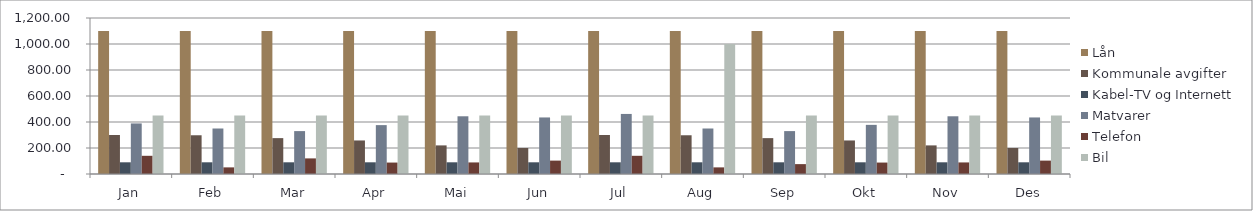
| Category | Lån | Kommunale avgifter | Kabel-TV og Internett | Matvarer | Telefon | Bil |
|---|---|---|---|---|---|---|
| Jan | 1100 | 300 | 90 | 389 | 140 | 450 |
| Feb | 1100 | 298 | 90 | 350 | 50.93 | 450 |
| Mar | 1100 | 276 | 90 | 330 | 120 | 450 |
| Apr | 1100 | 258 | 90 | 376 | 88 | 450 |
| Mai | 1100 | 220 | 90 | 444 | 89 | 450 |
| Jun | 1100 | 200 | 90 | 435 | 103 | 450 |
| Jul | 1100 | 300 | 90 | 462 | 140 | 450 |
| Aug | 1100 | 298 | 90 | 350 | 50.93 | 1000 |
| Sep | 1100 | 276 | 90 | 330 | 76 | 450 |
| Okt | 1100 | 258 | 90 | 378 | 88 | 450 |
| Nov | 1100 | 220 | 90 | 444 | 89 | 450 |
| Des | 1100 | 200 | 90 | 435 | 103 | 450 |